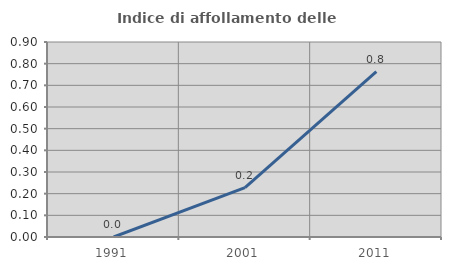
| Category | Indice di affollamento delle abitazioni  |
|---|---|
| 1991.0 | 0 |
| 2001.0 | 0.228 |
| 2011.0 | 0.763 |